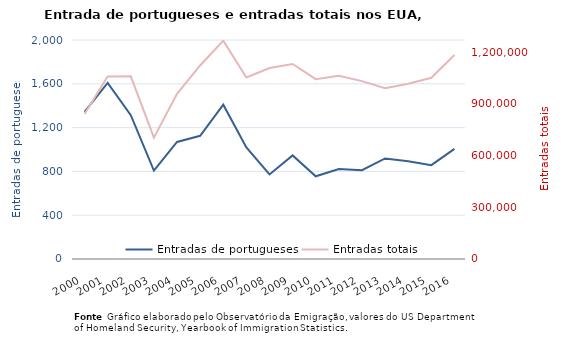
| Category | Entradas de portugueses |
|---|---|
| 2000.0 | 1343 |
| 2001.0 | 1609 |
| 2002.0 | 1313 |
| 2003.0 | 808 |
| 2004.0 | 1069 |
| 2005.0 | 1125 |
| 2006.0 | 1409 |
| 2007.0 | 1019 |
| 2008.0 | 772 |
| 2009.0 | 946 |
| 2010.0 | 755 |
| 2011.0 | 821 |
| 2012.0 | 811 |
| 2013.0 | 918 |
| 2014.0 | 892 |
| 2015.0 | 857 |
| 2016.0 | 1006 |